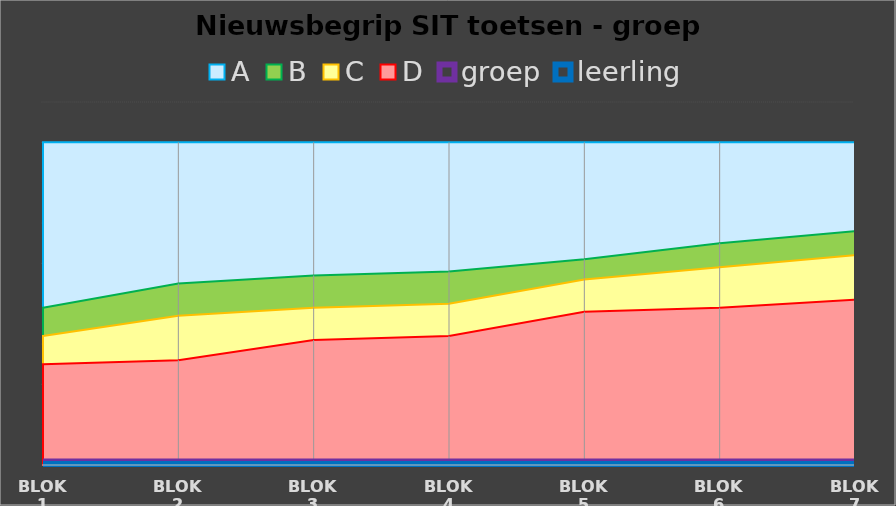
| Category | A | B | C | D | groep | leerling |
|---|---|---|---|---|---|---|
| blok 1 | 40 | 19.5 | 16 | 12.5 | 0 | 0 |
| blok 2 | 40 | 22.5 | 18.5 | 13 | 0 | 0 |
| blok 3 | 40 | 23.5 | 19.5 | 15.5 | 0 | 0 |
| blok 4 | 40 | 24 | 20 | 16 | 0 | 0 |
| blok 5 | 40 | 25.5 | 23 | 19 | 0 | 0 |
| blok 6 | 40 | 27.5 | 24.5 | 19.5 | 0 | 0 |
| blok 7 | 40 | 29 | 26 | 20.5 | 0 | 0 |